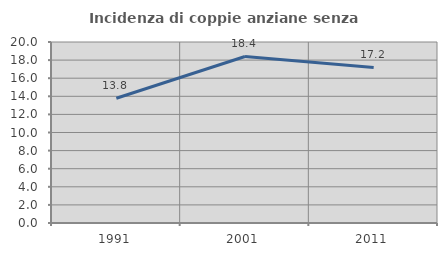
| Category | Incidenza di coppie anziane senza figli  |
|---|---|
| 1991.0 | 13.781 |
| 2001.0 | 18.4 |
| 2011.0 | 17.195 |